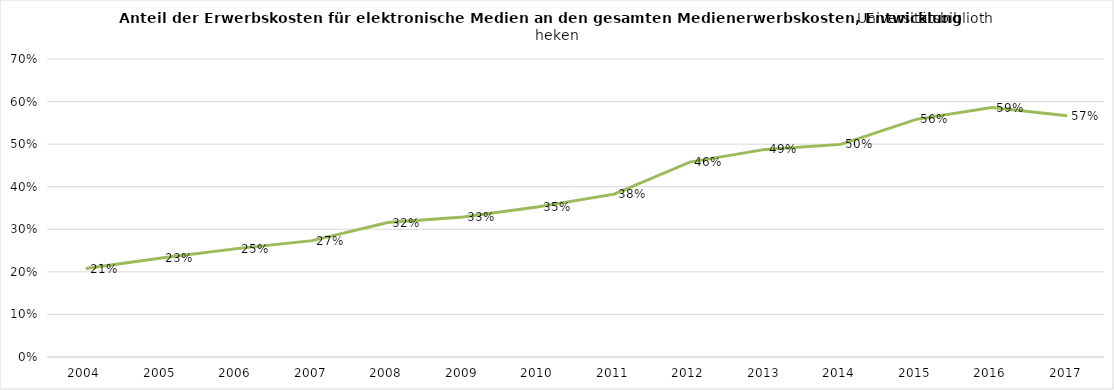
| Category | Anteil der Erwerbskosten für elektronische Medien 
an den gesamten Medienerwerbskosten |
|---|---|
| 2004.0 | 0.208 |
| 2005.0 | 0.232 |
| 2006.0 | 0.255 |
| 2007.0 | 0.273 |
| 2008.0 | 0.316 |
| 2009.0 | 0.329 |
| 2010.0 | 0.353 |
| 2011.0 | 0.382 |
| 2012.0 | 0.458 |
| 2013.0 | 0.488 |
| 2014.0 | 0.499 |
| 2015.0 | 0.558 |
| 2016.0 | 0.586 |
| 2017.0 | 0.567 |